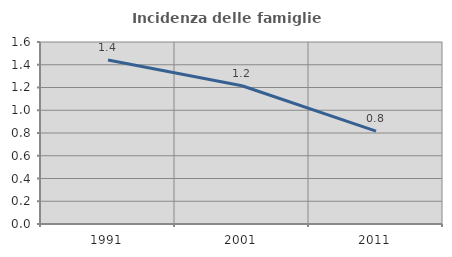
| Category | Incidenza delle famiglie numerose |
|---|---|
| 1991.0 | 1.441 |
| 2001.0 | 1.215 |
| 2011.0 | 0.817 |